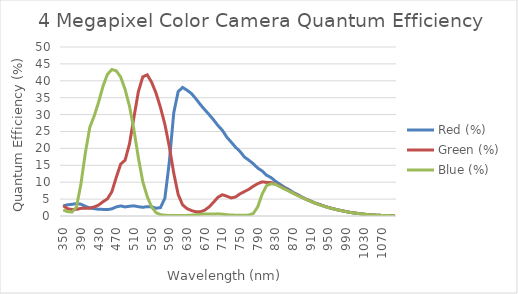
| Category | Red (%) | Green (%) | Blue (%) |
|---|---|---|---|
| 350.0 | 2.998 | 3.052 | 1.769 |
| 360.0 | 3.323 | 2.153 | 1.29 |
| 370.0 | 3.457 | 1.919 | 1.177 |
| 380.0 | 3.677 | 1.969 | 2.655 |
| 390.0 | 3.486 | 2.253 | 9.41 |
| 400.0 | 2.886 | 2.304 | 18.594 |
| 410.0 | 2.378 | 2.315 | 26.178 |
| 420.0 | 2.174 | 2.674 | 29.567 |
| 430.0 | 1.992 | 3.23 | 33.659 |
| 440.0 | 1.954 | 4.218 | 38.39 |
| 450.0 | 1.885 | 5.064 | 41.906 |
| 460.0 | 2.121 | 7.167 | 43.334 |
| 470.0 | 2.688 | 11.446 | 42.948 |
| 480.0 | 2.976 | 15.352 | 41.119 |
| 490.0 | 2.688 | 16.524 | 37.451 |
| 500.0 | 2.893 | 21.374 | 32.436 |
| 510.0 | 3.002 | 29.205 | 25.46 |
| 520.0 | 2.746 | 36.798 | 17.218 |
| 530.0 | 2.58 | 41.172 | 10.141 |
| 540.0 | 2.772 | 41.768 | 5.763 |
| 550.0 | 2.724 | 39.566 | 2.645 |
| 560.0 | 2.302 | 36.335 | 1.001 |
| 570.0 | 2.471 | 32.11 | 0.405 |
| 580.0 | 5.275 | 27.083 | 0.225 |
| 590.0 | 15.952 | 20.539 | 0.145 |
| 600.0 | 30.508 | 12.721 | 0.121 |
| 610.0 | 36.799 | 6.376 | 0.126 |
| 620.0 | 38.042 | 3.295 | 0.139 |
| 630.0 | 37.23 | 2.194 | 0.181 |
| 640.0 | 36.246 | 1.622 | 0.246 |
| 650.0 | 34.7 | 1.237 | 0.349 |
| 660.0 | 33.009 | 1.223 | 0.489 |
| 670.0 | 31.478 | 1.721 | 0.585 |
| 680.0 | 30.012 | 2.691 | 0.62 |
| 690.0 | 28.46 | 4.068 | 0.608 |
| 700.0 | 26.768 | 5.544 | 0.635 |
| 710.0 | 25.343 | 6.29 | 0.537 |
| 720.0 | 23.333 | 5.85 | 0.372 |
| 730.0 | 21.852 | 5.34 | 0.276 |
| 740.0 | 20.325 | 5.638 | 0.248 |
| 750.0 | 19.075 | 6.564 | 0.22 |
| 760.0 | 17.425 | 7.242 | 0.205 |
| 770.0 | 16.505 | 7.901 | 0.287 |
| 780.0 | 15.456 | 8.819 | 0.74 |
| 790.0 | 14.176 | 9.569 | 2.725 |
| 800.0 | 13.322 | 10.1 | 6.481 |
| 810.0 | 12.064 | 9.942 | 8.988 |
| 820.0 | 11.376 | 9.906 | 9.525 |
| 830.0 | 10.296 | 9.436 | 9.383 |
| 840.0 | 9.409 | 8.905 | 8.692 |
| 850.0 | 8.543 | 8.191 | 8 |
| 860.0 | 7.853 | 7.489 | 7.406 |
| 870.0 | 6.995 | 6.748 | 6.758 |
| 880.0 | 6.359 | 6.214 | 6.048 |
| 890.0 | 5.594 | 5.513 | 5.529 |
| 900.0 | 4.953 | 4.909 | 4.831 |
| 910.0 | 4.427 | 4.37 | 4.324 |
| 920.0 | 3.833 | 3.772 | 3.801 |
| 930.0 | 3.402 | 3.383 | 3.276 |
| 940.0 | 2.936 | 2.901 | 2.872 |
| 950.0 | 2.506 | 2.517 | 2.474 |
| 960.0 | 2.172 | 2.16 | 2.146 |
| 970.0 | 1.848 | 1.838 | 1.823 |
| 980.0 | 1.581 | 1.57 | 1.544 |
| 990.0 | 1.303 | 1.296 | 1.294 |
| 1000.0 | 1.047 | 1.048 | 1.029 |
| 1010.0 | 0.874 | 0.873 | 0.84 |
| 1020.0 | 0.698 | 0.695 | 0.687 |
| 1030.0 | 0.533 | 0.525 | 0.532 |
| 1040.0 | 0.404 | 0.398 | 0.4 |
| 1050.0 | 0.313 | 0.31 | 0.307 |
| 1060.0 | 0.233 | 0.23 | 0.232 |
| 1070.0 | 0.174 | 0.177 | 0.17 |
| 1080.0 | 0.139 | 0.138 | 0.135 |
| 1090.0 | 0.11 | 0.116 | 0.106 |
| 1100.0 | 0.09 | 0.1 | 0.09 |